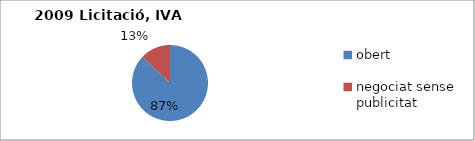
| Category | Licitació, IVA exclòs |
|---|---|
| obert | 30577853.23 |
| negociat sense publicitat  | 4499026.53 |